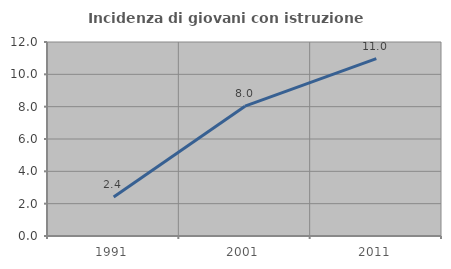
| Category | Incidenza di giovani con istruzione universitaria |
|---|---|
| 1991.0 | 2.41 |
| 2001.0 | 8.029 |
| 2011.0 | 10.976 |